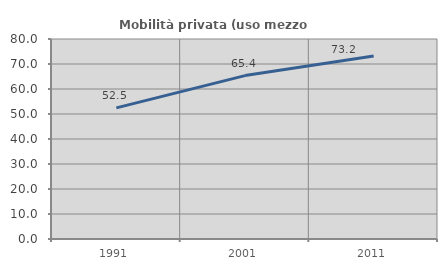
| Category | Mobilità privata (uso mezzo privato) |
|---|---|
| 1991.0 | 52.45 |
| 2001.0 | 65.365 |
| 2011.0 | 73.197 |